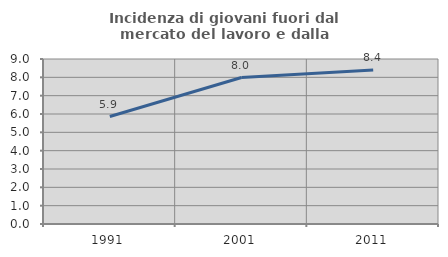
| Category | Incidenza di giovani fuori dal mercato del lavoro e dalla formazione  |
|---|---|
| 1991.0 | 5.863 |
| 2001.0 | 7.988 |
| 2011.0 | 8.402 |